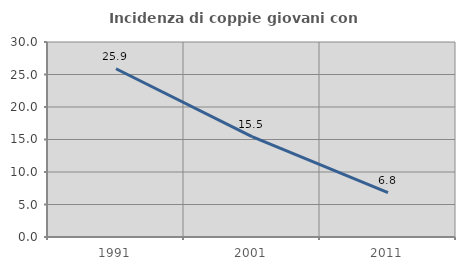
| Category | Incidenza di coppie giovani con figli |
|---|---|
| 1991.0 | 25.883 |
| 2001.0 | 15.452 |
| 2011.0 | 6.826 |